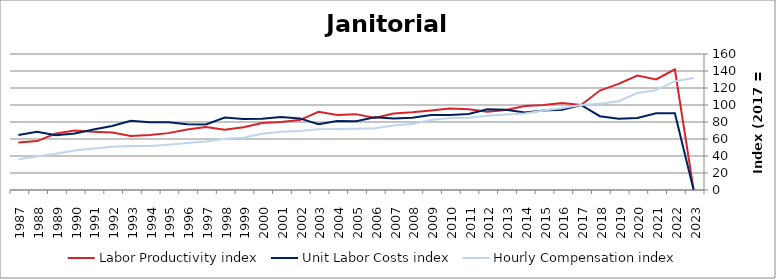
| Category | Labor Productivity index | Unit Labor Costs index | Hourly Compensation index |
|---|---|---|---|
| 2023.0 | 0 | 0 | 131.892 |
| 2022.0 | 141.999 | 90.167 | 128.035 |
| 2021.0 | 130.071 | 90.323 | 117.485 |
| 2020.0 | 134.667 | 84.722 | 114.093 |
| 2019.0 | 124.778 | 83.74 | 104.489 |
| 2018.0 | 117.017 | 86.832 | 101.608 |
| 2017.0 | 100 | 100 | 100 |
| 2016.0 | 102.248 | 94.264 | 96.383 |
| 2015.0 | 99.973 | 93.588 | 93.562 |
| 2014.0 | 98.864 | 91.056 | 90.022 |
| 2013.0 | 94.141 | 94.356 | 88.828 |
| 2012.0 | 91.963 | 94.982 | 87.348 |
| 2011.0 | 94.997 | 89.529 | 85.05 |
| 2010.0 | 95.873 | 88.361 | 84.715 |
| 2009.0 | 93.457 | 88.125 | 82.359 |
| 2008.0 | 91.4 | 84.967 | 77.66 |
| 2007.0 | 89.984 | 84.21 | 75.775 |
| 2006.0 | 84.717 | 85.697 | 72.6 |
| 2005.0 | 89.244 | 80.903 | 72.201 |
| 2004.0 | 88.306 | 81.249 | 71.748 |
| 2003.0 | 92.086 | 77.475 | 71.343 |
| 2002.0 | 82.299 | 84.243 | 69.332 |
| 2001.0 | 79.926 | 85.828 | 68.599 |
| 2000.0 | 78.721 | 83.899 | 66.047 |
| 1999.0 | 73.734 | 83.456 | 61.536 |
| 1998.0 | 70.798 | 85.3 | 60.391 |
| 1997.0 | 74.065 | 77.028 | 57.05 |
| 1996.0 | 71.284 | 77.486 | 55.235 |
| 1995.0 | 66.912 | 79.661 | 53.303 |
| 1994.0 | 64.73 | 79.832 | 51.675 |
| 1993.0 | 63.51 | 81.408 | 51.702 |
| 1992.0 | 67.657 | 75.221 | 50.892 |
| 1991.0 | 68.572 | 71.05 | 48.72 |
| 1990.0 | 69.876 | 66.503 | 46.469 |
| 1989.0 | 66.426 | 64.359 | 42.751 |
| 1988.0 | 57.549 | 68.643 | 39.504 |
| 1987.0 | 56.007 | 64.642 | 36.204 |